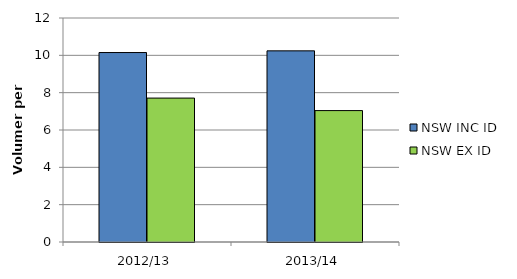
| Category | NSW INC ID | NSW EX ID |
|---|---|---|
| 2012/13 | 10.15 | 7.71 |
| 2013/14 | 10.24 | 7.04 |